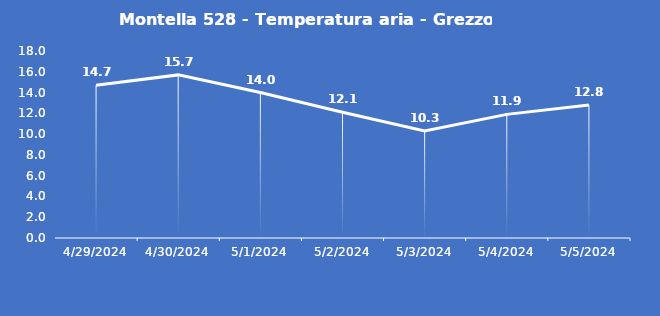
| Category | Montella 528 - Temperatura aria - Grezzo (°C) |
|---|---|
| 4/29/24 | 14.7 |
| 4/30/24 | 15.7 |
| 5/1/24 | 14 |
| 5/2/24 | 12.1 |
| 5/3/24 | 10.3 |
| 5/4/24 | 11.9 |
| 5/5/24 | 12.8 |